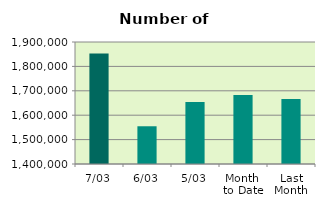
| Category | Series 0 |
|---|---|
| 7/03 | 1853238 |
| 6/03 | 1554646 |
| 5/03 | 1653910 |
| Month 
to Date | 1682819.6 |
| Last
Month | 1666801.1 |